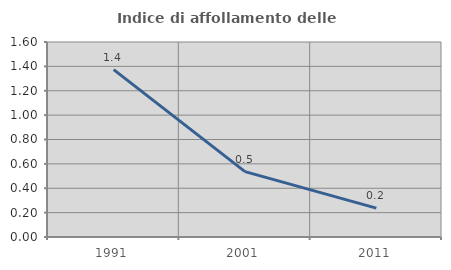
| Category | Indice di affollamento delle abitazioni  |
|---|---|
| 1991.0 | 1.373 |
| 2001.0 | 0.536 |
| 2011.0 | 0.237 |